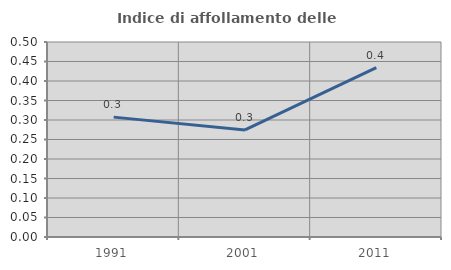
| Category | Indice di affollamento delle abitazioni  |
|---|---|
| 1991.0 | 0.307 |
| 2001.0 | 0.274 |
| 2011.0 | 0.434 |